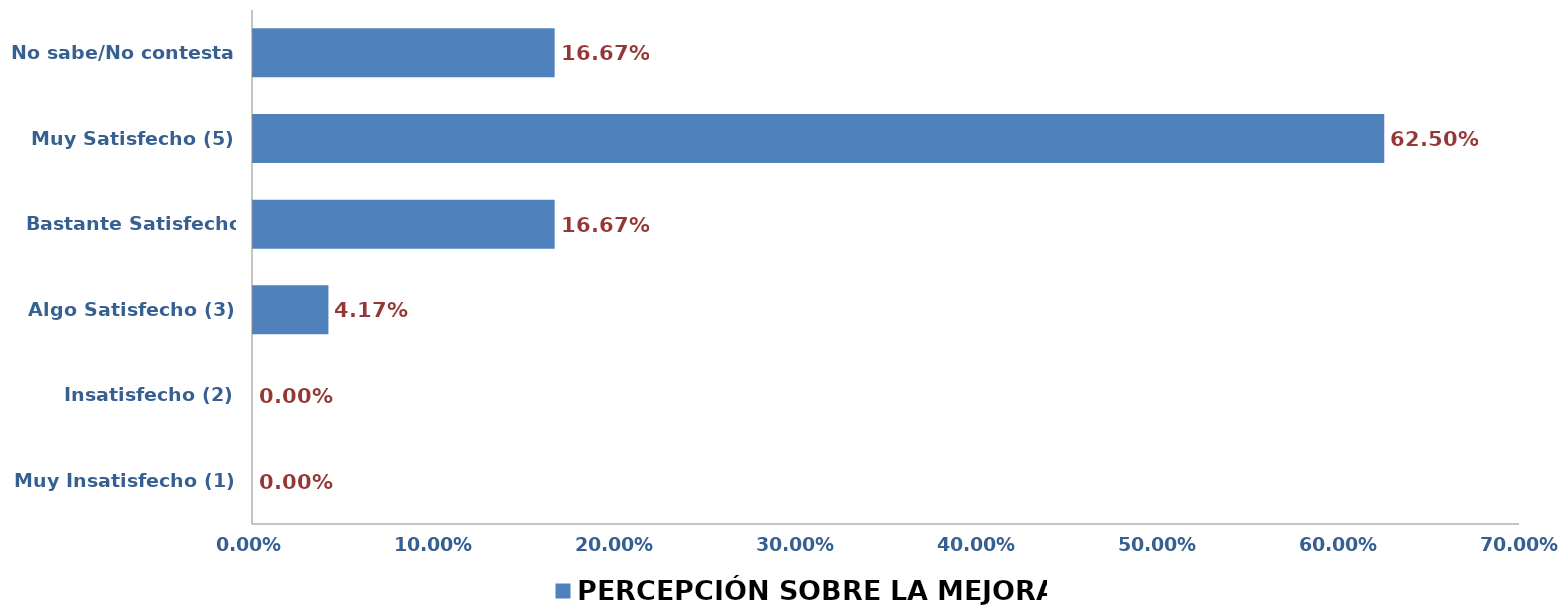
| Category | PERCEPCIÓN SOBRE LA MEJORA |
|---|---|
| Muy Insatisfecho (1) | 0 |
| Insatisfecho (2) | 0 |
| Algo Satisfecho (3) | 0.042 |
| Bastante Satisfecho (4) | 0.167 |
| Muy Satisfecho (5) | 0.625 |
| No sabe/No contesta | 0.167 |